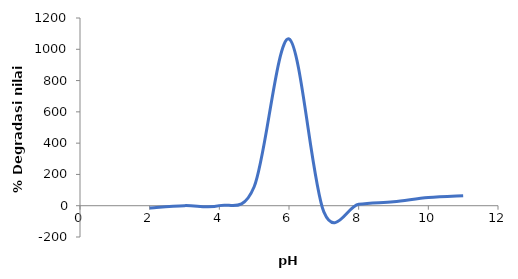
| Category | a |
|---|---|
| 2.0 | -13.975 |
| 3.0 | 0.466 |
| 4.0 | 0.399 |
| 5.0 | 121.232 |
| 6.0 | 1065.981 |
| 7.0 | -39.768 |
| 8.0 | 8.943 |
| 9.0 | 25.318 |
| 10.0 | 52.309 |
| 11.0 | 64.332 |